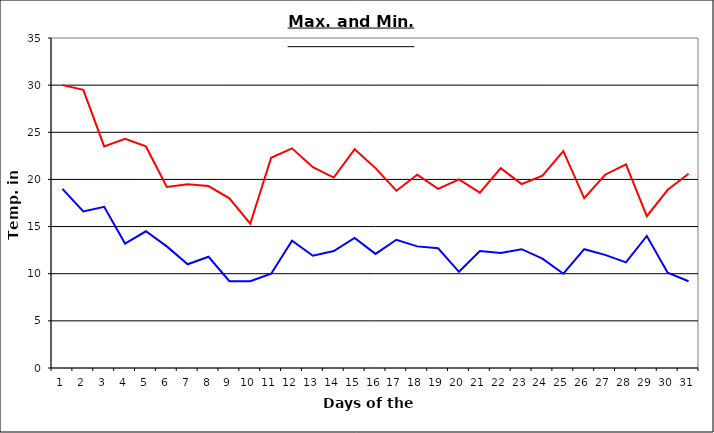
| Category | Series 0 | Series 1 |
|---|---|---|
| 0 | 30 | 19 |
| 1 | 29.5 | 16.6 |
| 2 | 23.5 | 17.1 |
| 3 | 24.3 | 13.2 |
| 4 | 23.5 | 14.5 |
| 5 | 19.2 | 12.9 |
| 6 | 19.5 | 11 |
| 7 | 19.3 | 11.8 |
| 8 | 18 | 9.2 |
| 9 | 15.3 | 9.2 |
| 10 | 22.3 | 10 |
| 11 | 23.3 | 13.5 |
| 12 | 21.3 | 11.9 |
| 13 | 20.2 | 12.4 |
| 14 | 23.2 | 13.8 |
| 15 | 21.2 | 12.1 |
| 16 | 18.8 | 13.6 |
| 17 | 20.5 | 12.9 |
| 18 | 19 | 12.7 |
| 19 | 20 | 10.2 |
| 20 | 18.6 | 12.4 |
| 21 | 21.2 | 12.2 |
| 22 | 19.5 | 12.6 |
| 23 | 20.4 | 11.6 |
| 24 | 23 | 10 |
| 25 | 18 | 12.6 |
| 26 | 20.5 | 12 |
| 27 | 21.6 | 11.2 |
| 28 | 16.1 | 14 |
| 29 | 18.9 | 10.1 |
| 30 | 20.6 | 9.2 |